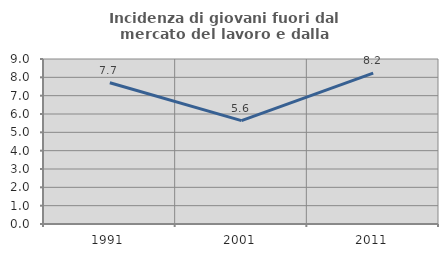
| Category | Incidenza di giovani fuori dal mercato del lavoro e dalla formazione  |
|---|---|
| 1991.0 | 7.707 |
| 2001.0 | 5.637 |
| 2011.0 | 8.225 |